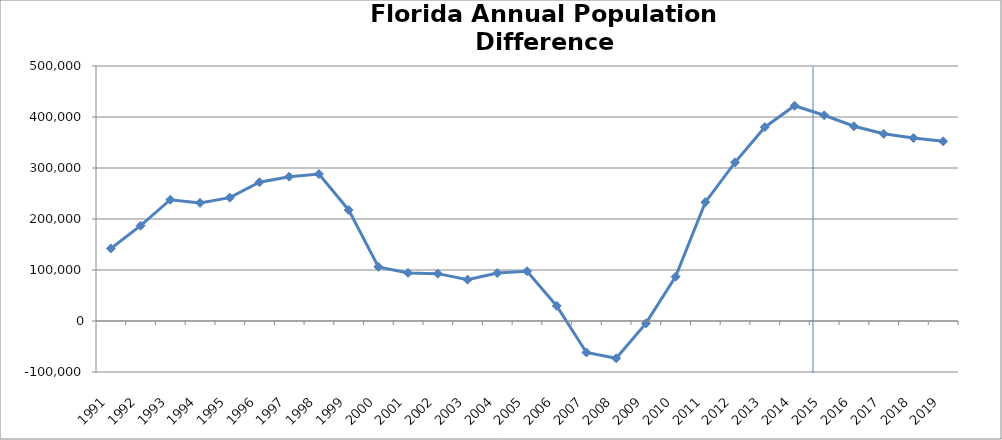
| Category | Difference |
|---|---|
| 1991-01-01 | 142156.583 |
| 1992-01-01 | 186893.034 |
| 1993-01-01 | 237820.428 |
| 1994-01-01 | 231625.794 |
| 1995-01-01 | 241869.059 |
| 1996-01-01 | 272085.854 |
| 1997-01-01 | 282984.254 |
| 1998-01-01 | 288135.221 |
| 1999-01-01 | 217798.765 |
| 2000-01-01 | 106154.056 |
| 2001-01-01 | 94346.867 |
| 2002-01-01 | 92869.504 |
| 2003-01-01 | 81140.536 |
| 2004-01-01 | 94006.749 |
| 2005-01-01 | 97577.378 |
| 2006-01-01 | 29606.858 |
| 2007-01-01 | -61707.104 |
| 2008-01-01 | -73143.909 |
| 2009-01-01 | -4639.755 |
| 2010-01-01 | 86928.75 |
| 2011-01-01 | 233055.527 |
| 2012-01-01 | 311067.633 |
| 2013-01-01 | 380077.056 |
| 2014-01-01 | 422023.636 |
| 2015-01-01 | 403401.203 |
| 2016-01-01 | 381854.018 |
| 2017-01-01 | 367012.421 |
| 2018-01-01 | 358838.279 |
| 2019-01-01 | 352239.767 |